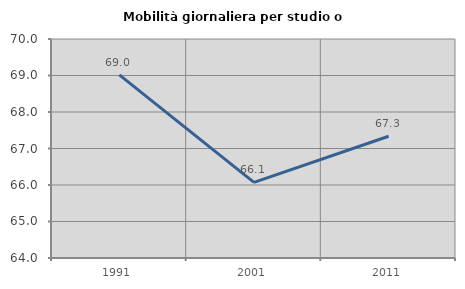
| Category | Mobilità giornaliera per studio o lavoro |
|---|---|
| 1991.0 | 69.015 |
| 2001.0 | 66.071 |
| 2011.0 | 67.335 |